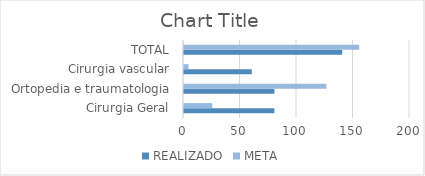
| Category | REALIZADO | META |
|---|---|---|
| Cirurgia Geral | 80 | 25 |
| Ortopedia e traumatologia | 80 | 126 |
| Cirurgia vascular | 60 | 4 |
| TOTAL | 140 | 155 |